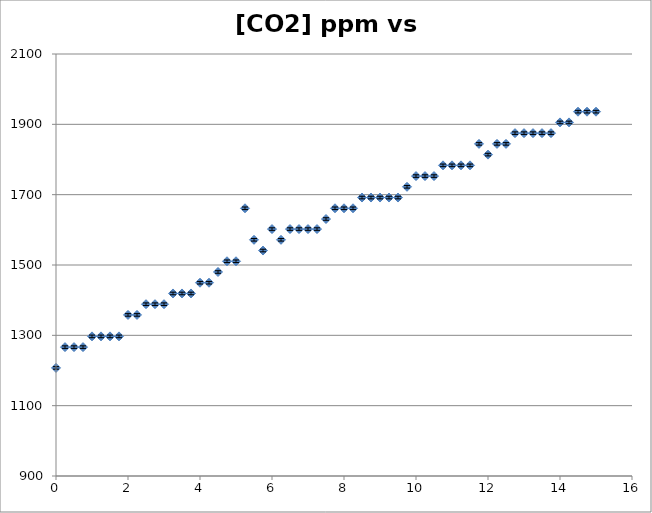
| Category | [CO2] ppm |
|---|---|
| 0.0 | 1207.352 |
| 0.25 | 1266.479 |
| 0.5 | 1266.479 |
| 0.75 | 1266.479 |
| 1.0 | 1296.997 |
| 1.25 | 1296.997 |
| 1.5 | 1296.997 |
| 1.75 | 1296.997 |
| 2.0 | 1358.032 |
| 2.25 | 1358.032 |
| 2.5 | 1388.55 |
| 2.75 | 1388.55 |
| 3.0 | 1388.55 |
| 3.25 | 1419.067 |
| 3.5 | 1419.067 |
| 3.75 | 1419.067 |
| 4.0 | 1449.585 |
| 4.25 | 1449.585 |
| 4.5 | 1480.103 |
| 4.75 | 1510.62 |
| 5.0 | 1510.62 |
| 5.25 | 1661.301 |
| 5.5 | 1571.655 |
| 5.75 | 1541.138 |
| 6.0 | 1602.173 |
| 6.25 | 1571.655 |
| 6.5 | 1602.173 |
| 6.75 | 1602.173 |
| 7.0 | 1602.173 |
| 7.25 | 1602.173 |
| 7.5 | 1630.783 |
| 7.75 | 1661.301 |
| 8.0 | 1661.301 |
| 8.25 | 1661.301 |
| 8.5 | 1691.818 |
| 8.75 | 1691.818 |
| 9.0 | 1691.818 |
| 9.25 | 1691.818 |
| 9.5 | 1691.818 |
| 9.75 | 1722.336 |
| 10.0 | 1752.853 |
| 10.25 | 1752.853 |
| 10.5 | 1752.853 |
| 10.75 | 1783.371 |
| 11.0 | 1783.371 |
| 11.25 | 1783.371 |
| 11.5 | 1783.371 |
| 11.75 | 1844.406 |
| 12.0 | 1813.889 |
| 12.25 | 1844.406 |
| 12.5 | 1844.406 |
| 12.75 | 1874.924 |
| 13.0 | 1874.924 |
| 13.25 | 1874.924 |
| 13.5 | 1874.924 |
| 13.75 | 1874.924 |
| 14.0 | 1905.441 |
| 14.25 | 1905.441 |
| 14.5 | 1935.959 |
| 14.75 | 1935.959 |
| 15.0 | 1935.959 |